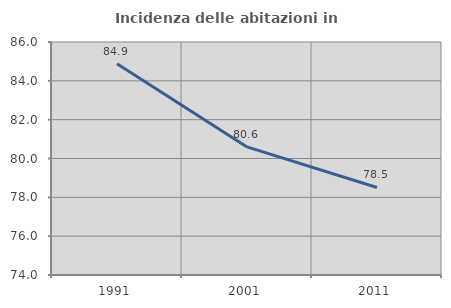
| Category | Incidenza delle abitazioni in proprietà  |
|---|---|
| 1991.0 | 84.884 |
| 2001.0 | 80.597 |
| 2011.0 | 78.509 |